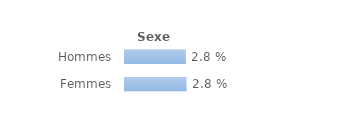
| Category | Series 0 |
|---|---|
| Hommes | 0.028 |
| Femmes | 0.028 |